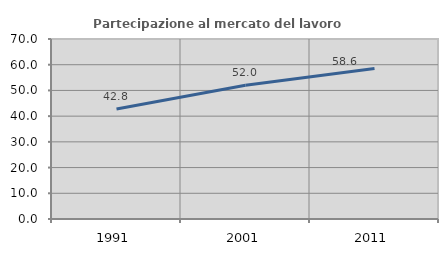
| Category | Partecipazione al mercato del lavoro  femminile |
|---|---|
| 1991.0 | 42.752 |
| 2001.0 | 51.997 |
| 2011.0 | 58.552 |